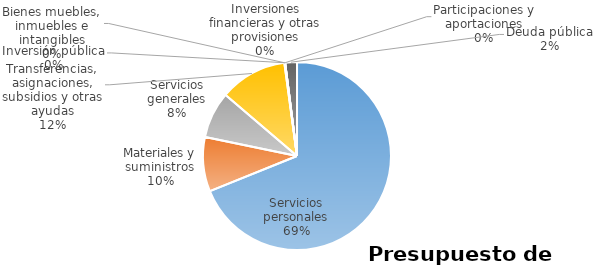
| Category | Series 0 | Series 1 | Series 2 | Series 3 | Series 4 | Series 5 |
|---|---|---|---|---|---|---|
| Servicios personales | 73307754 |  |  |  |  |  |
| Materiales y suministros | 9951000 |  |  |  |  |  |
| Servicios generales | 8511304 |  |  |  |  |  |
| Transferencias, asignaciones, subsidios y otras ayudas | 12345096 |  |  |  |  |  |
| Bienes muebles, inmuebles e intangibles | 136000 |  |  |  |  |  |
| Inversión pública | 0 |  |  |  |  |  |
| Inversiones financieras y otras provisiones | 0 |  |  |  |  |  |
| Participaciones y aportaciones | 0 |  |  |  |  |  |
| Deuda pública | 2154710 |  |  |  |  |  |